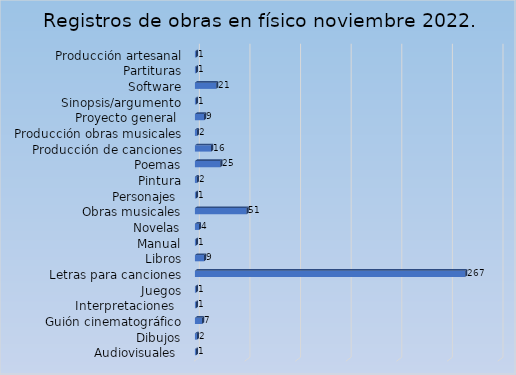
| Category | Cantidad |
|---|---|
| Audiovisuales  | 1 |
| Dibujos | 2 |
| Guión cinematográfico | 7 |
| Interpretaciones   | 1 |
| Juegos | 1 |
| Letras para canciones | 267 |
| Libros | 9 |
| Manual | 1 |
| Novelas | 4 |
| Obras musicales | 51 |
| Personajes  | 1 |
| Pintura | 2 |
| Poemas | 25 |
| Producción de canciones | 16 |
| Producción obras musicales | 2 |
| Proyecto general  | 9 |
| Sinopsis/argumento | 1 |
| Software | 21 |
| Partituras | 1 |
| Producción artesanal | 1 |